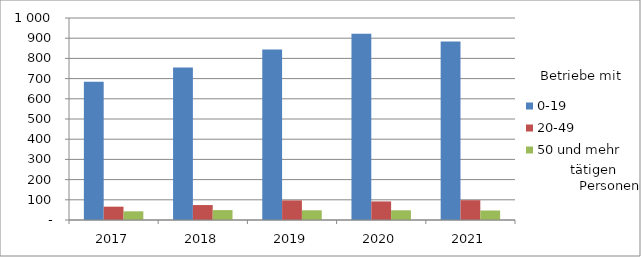
| Category | 0-19 | 20-49 | 50 und mehr |
|---|---|---|---|
| 2017.0 | 685 | 66 | 43 |
| 2018.0 | 755 | 74 | 49 |
| 2019.0 | 844 | 97 | 48 |
| 2020.0 | 922 | 92 | 48 |
| 2021.0 | 884 | 98 | 47 |